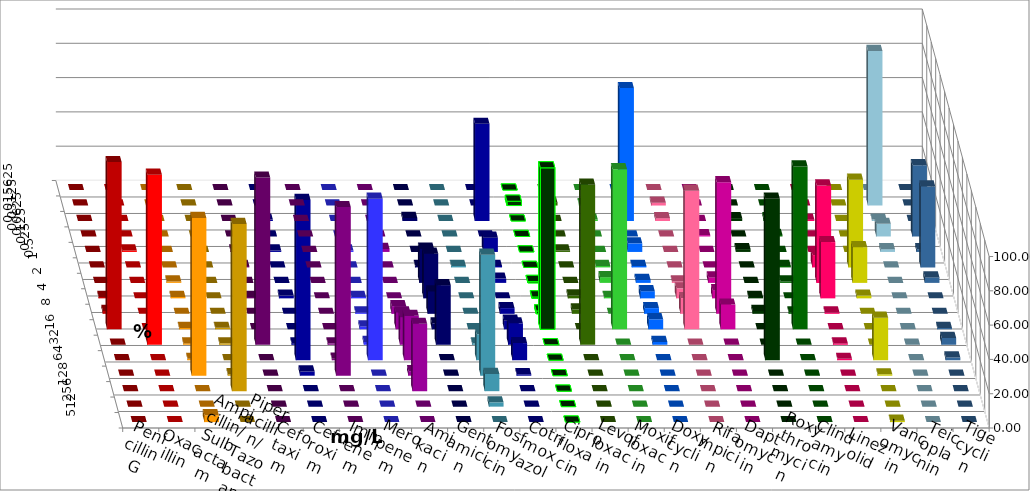
| Category | Penicillin G | Oxacillin | Ampicillin/ Sulbactam | Piperacillin/ Tazobactam | Cefotaxim | Cefuroxim | Imipenem | Meropenem | Amikacin | Gentamicin | Fosfomycin | Cotrimoxazol | Ciprofloxacin | Levofloxacin | Moxifloxacin | Doxycyclin | Rifampicin | Daptomycin | Roxythromycin | Clindamycin | Linezolid | Vancomycin | Teicoplanin | Tigecyclin |
|---|---|---|---|---|---|---|---|---|---|---|---|---|---|---|---|---|---|---|---|---|---|---|---|---|
| 0.015625 | 0 | 0 | 0 | 0 | 0 | 0 | 0 | 0 | 0 | 0 | 0 | 0 | 0 | 0 | 0 | 0 | 0 | 0 | 0 | 0 | 0 | 0 | 0 | 0 |
| 0.03125 | 0 | 0 | 0 | 0 | 0 | 0 | 0 | 0 | 0 | 0 | 0 | 0 | 2.5 | 1.667 | 0.833 | 0 | 1.667 | 0 | 0 | 0 | 0 | 0 | 0 | 90.164 |
| 0.0625 | 0 | 0 | 0 | 0 | 0 | 0 | 0.813 | 0 | 0 | 1.739 | 0 | 56.667 | 0 | 0 | 0.833 | 77.5 | 1.667 | 0 | 1.667 | 1.667 | 0.8 | 0 | 0 | 0.82 |
| 0.125 | 0 | 0 | 0 | 0 | 0 | 0 | 0 | 0 | 0 | 0 | 0 | 0 | 0 | 0 | 0 | 0 | 0 | 0.8 | 0 | 0.833 | 0 | 0 | 41.6 | 7.377 |
| 0.25 | 0 | 0.84 | 0 | 0 | 0.833 | 0 | 0.813 | 0.833 | 1.786 | 0 | 0 | 8.333 | 0 | 0.833 | 0 | 5 | 0 | 0 | 1.667 | 0 | 0 | 0 | 1.6 | 1.639 |
| 0.5 | 0 | 0 | 0 | 0 | 0.833 | 0 | 0 | 0 | 0 | 0.87 | 0.84 | 0.833 | 0 | 0 | 0.833 | 0.833 | 0 | 0 | 0 | 0.833 | 7.2 | 51.2 | 47.2 | 0 |
| 1.0 | 0 | 0 | 0.8 | 0 | 0 | 0 | 0 | 0 | 0 | 20 | 0 | 2.5 | 0.833 | 0 | 3.333 | 1.667 | 0.833 | 3.2 | 0 | 0.833 | 56.8 | 20.8 | 3.2 | 0 |
| 2.0 | 0.833 | 0 | 0.8 | 0 | 0.833 | 0 | 1.626 | 0.833 | 0 | 26.087 | 0 | 0 | 0.833 | 1.667 | 0.833 | 4.167 | 5.833 | 4.8 | 0.833 | 0 | 32.8 | 1.6 | 0 | 0 |
| 4.0 | 1.667 | 0 | 0 | 0 | 0 | 0 | 0 | 0.833 | 4.464 | 13.043 | 0 | 3.333 | 1.667 | 2.5 | 0 | 3.333 | 9.167 | 76.8 | 1.667 | 0.833 | 0.8 | 0 | 0 | 0 |
| 8.0 | 97.5 | 0 | 0.8 | 0.833 | 0 | 0 | 0 | 1.667 | 9.821 | 3.478 | 0 | 5 | 94.167 | 0 | 93.333 | 5.833 | 80.833 | 14.4 | 0 | 95 | 0 | 0 | 0.8 | 0 |
| 16.0 | 0 | 99.16 | 0.8 | 0.833 | 97.5 | 0.833 | 0.813 | 1.667 | 16.071 | 34.783 | 0.84 | 12.5 | 0 | 93.333 | 0 | 1.667 | 0 | 0 | 0 | 0 | 0.8 | 0 | 4 | 0 |
| 32.0 | 0 | 0 | 0.8 | 0 | 0 | 0.833 | 93.496 | 94.167 | 25.893 | 0 | 15.126 | 10 | 0 | 0 | 0 | 0 | 0 | 0 | 94.167 | 0 | 0.8 | 24.8 | 1.6 | 0 |
| 64.0 | 0 | 0 | 92 | 0.833 | 0 | 98.333 | 2.439 | 0 | 2.679 | 0 | 70.588 | 0.833 | 0 | 0 | 0 | 0 | 0 | 0 | 0 | 0 | 0 | 0.8 | 0 | 0 |
| 128.0 | 0 | 0 | 0 | 97.5 | 0 | 0 | 0 | 0 | 39.286 | 0 | 10.084 | 0 | 0 | 0 | 0 | 0 | 0 | 0 | 0 | 0 | 0 | 0 | 0 | 0 |
| 256.0 | 0 | 0 | 0 | 0 | 0 | 0 | 0 | 0 | 0 | 0 | 2.521 | 0 | 0 | 0 | 0 | 0 | 0 | 0 | 0 | 0 | 0 | 0 | 0 | 0 |
| 512.0 | 0 | 0 | 4 | 0 | 0 | 0 | 0 | 0 | 0 | 0 | 0 | 0 | 0 | 0 | 0 | 0 | 0 | 0 | 0 | 0 | 0 | 0.8 | 0 | 0 |